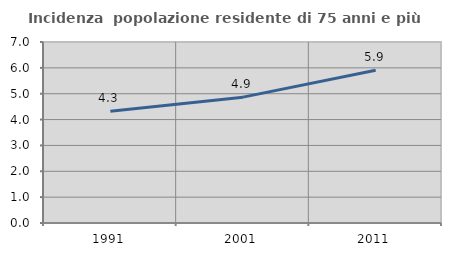
| Category | Incidenza  popolazione residente di 75 anni e più |
|---|---|
| 1991.0 | 4.326 |
| 2001.0 | 4.867 |
| 2011.0 | 5.909 |